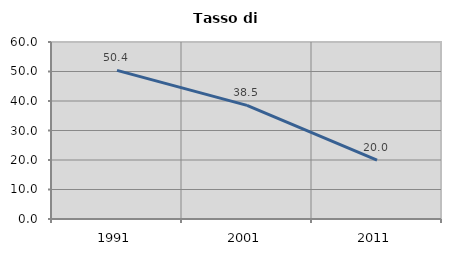
| Category | Tasso di disoccupazione   |
|---|---|
| 1991.0 | 50.387 |
| 2001.0 | 38.5 |
| 2011.0 | 19.974 |